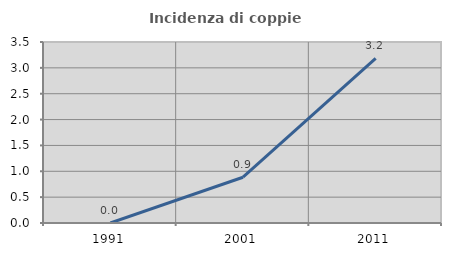
| Category | Incidenza di coppie miste |
|---|---|
| 1991.0 | 0 |
| 2001.0 | 0.885 |
| 2011.0 | 3.182 |